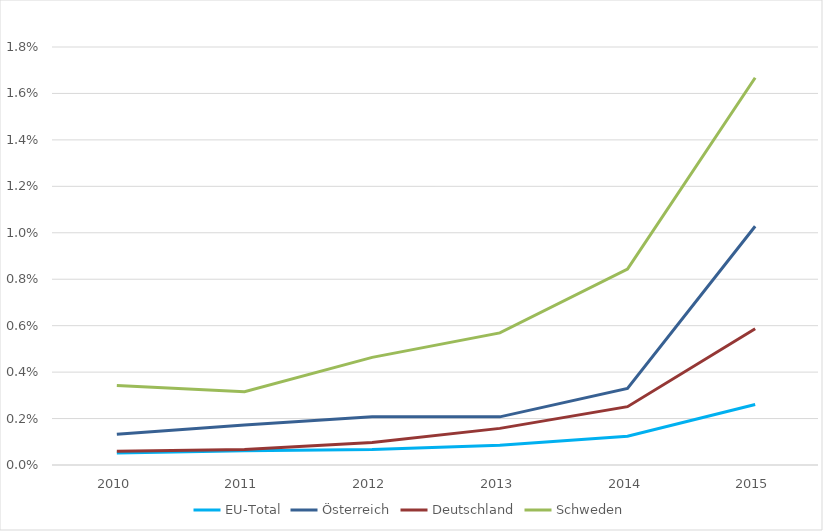
| Category | EU-Total | Österreich | Deutschland | Schweden |
|---|---|---|---|---|
| 2010.0 | 0.001 | 0.001 | 0.001 | 0.003 |
| 2011.0 | 0.001 | 0.002 | 0.001 | 0.003 |
| 2012.0 | 0.001 | 0.002 | 0.001 | 0.005 |
| 2013.0 | 0.001 | 0.002 | 0.002 | 0.006 |
| 2014.0 | 0.001 | 0.003 | 0.003 | 0.008 |
| 2015.0 | 0.003 | 0.01 | 0.006 | 0.017 |